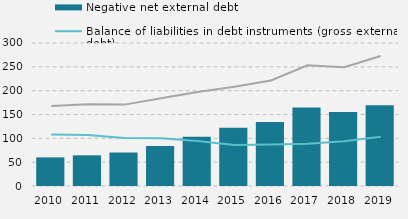
| Category | Negative net external debt |
|---|---|
| 0 | 60.041 |
| 1 | 64.336 |
| 2 | 70.274 |
| 3 | 84.105 |
| 4 | 103.091 |
| 5 | 122.16 |
| 6 | 134.149 |
| 7 | 164.642 |
| 8 | 155.3 |
| 9 | 169.3 |